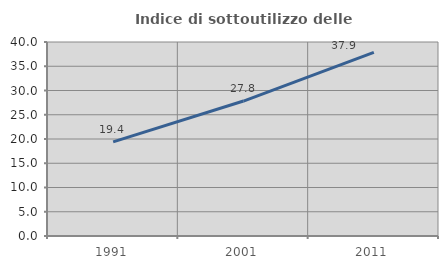
| Category | Indice di sottoutilizzo delle abitazioni  |
|---|---|
| 1991.0 | 19.41 |
| 2001.0 | 27.824 |
| 2011.0 | 37.853 |